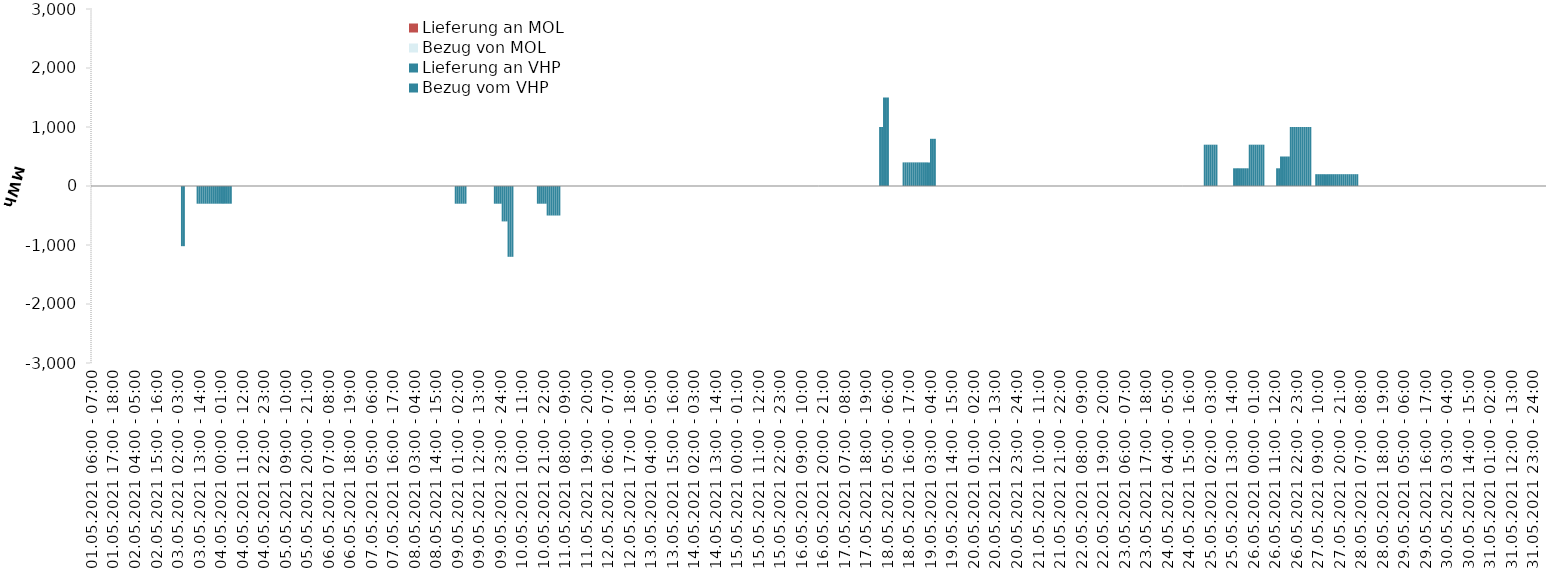
| Category | Bezug vom VHP | Lieferung an VHP | Bezug von MOL | Lieferung an MOL |
|---|---|---|---|---|
| 01.05.2021 06:00 - 07:00 | 0 | 0 | 0 | 0 |
| 01.05.2021 07:00 - 08:00 | 0 | 0 | 0 | 0 |
| 01.05.2021 08:00 - 09:00 | 0 | 0 | 0 | 0 |
| 01.05.2021 09:00 - 10:00 | 0 | 0 | 0 | 0 |
| 01.05.2021 10:00 - 11:00 | 0 | 0 | 0 | 0 |
| 01.05.2021 11:00 - 12:00 | 0 | 0 | 0 | 0 |
| 01.05.2021 12:00 - 13:00 | 0 | 0 | 0 | 0 |
| 01.05.2021 13:00 - 14:00 | 0 | 0 | 0 | 0 |
| 01.05.2021 14:00 - 15:00 | 0 | 0 | 0 | 0 |
| 01.05.2021 15:00 - 16:00 | 0 | 0 | 0 | 0 |
| 01.05.2021 16:00 - 17:00 | 0 | 0 | 0 | 0 |
| 01.05.2021 17:00 - 18:00 | 0 | 0 | 0 | 0 |
| 01.05.2021 18:00 - 19:00 | 0 | 0 | 0 | 0 |
| 01.05.2021 19:00 - 20:00 | 0 | 0 | 0 | 0 |
| 01.05.2021 20:00 - 21:00 | 0 | 0 | 0 | 0 |
| 01.05.2021 21:00 - 22:00 | 0 | 0 | 0 | 0 |
| 01.05.2021 22:00 - 23:00 | 0 | 0 | 0 | 0 |
| 01.05.2021 23:00 - 24:00 | 0 | 0 | 0 | 0 |
| 02.05.2021 00:00 - 01:00 | 0 | 0 | 0 | 0 |
| 02.05.2021 01:00 - 02:00 | 0 | 0 | 0 | 0 |
| 02.05.2021 02:00 - 03:00 | 0 | 0 | 0 | 0 |
| 02.05.2021 03:00 - 04:00 | 0 | 0 | 0 | 0 |
| 02.05.2021 04:00 - 05:00 | 0 | 0 | 0 | 0 |
| 02.05.2021 05:00 - 06:00 | 0 | 0 | 0 | 0 |
| 02.05.2021 06:00 - 07:00 | 0 | 0 | 0 | 0 |
| 02.05.2021 07:00 - 08:00 | 0 | 0 | 0 | 0 |
| 02.05.2021 08:00 - 09:00 | 0 | 0 | 0 | 0 |
| 02.05.2021 09:00 - 10:00 | 0 | 0 | 0 | 0 |
| 02.05.2021 10:00 - 11:00 | 0 | 0 | 0 | 0 |
| 02.05.2021 11:00 - 12:00 | 0 | 0 | 0 | 0 |
| 02.05.2021 12:00 - 13:00 | 0 | 0 | 0 | 0 |
| 02.05.2021 13:00 - 14:00 | 0 | 0 | 0 | 0 |
| 02.05.2021 14:00 - 15:00 | 0 | 0 | 0 | 0 |
| 02.05.2021 15:00 - 16:00 | 0 | 0 | 0 | 0 |
| 02.05.2021 16:00 - 17:00 | 0 | 0 | 0 | 0 |
| 02.05.2021 17:00 - 18:00 | 0 | 0 | 0 | 0 |
| 02.05.2021 18:00 - 19:00 | 0 | 0 | 0 | 0 |
| 02.05.2021 19:00 - 20:00 | 0 | 0 | 0 | 0 |
| 02.05.2021 20:00 - 21:00 | 0 | 0 | 0 | 0 |
| 02.05.2021 21:00 - 22:00 | 0 | 0 | 0 | 0 |
| 02.05.2021 22:00 - 23:00 | 0 | 0 | 0 | 0 |
| 02.05.2021 23:00 - 24:00 | 0 | 0 | 0 | 0 |
| 03.05.2021 00:00 - 01:00 | 0 | 0 | 0 | 0 |
| 03.05.2021 01:00 - 02:00 | 0 | 0 | 0 | 0 |
| 03.05.2021 02:00 - 03:00 | 0 | 0 | 0 | 0 |
| 03.05.2021 03:00 - 04:00 | 0 | 0 | 0 | 0 |
| 03.05.2021 04:00 - 05:00 | 0 | -1020 | 0 | 0 |
| 03.05.2021 05:00 - 06:00 | 0 | -1020 | 0 | 0 |
| 03.05.2021 06:00 - 07:00 | 0 | 0 | 0 | 0 |
| 03.05.2021 07:00 - 08:00 | 0 | 0 | 0 | 0 |
| 03.05.2021 08:00 - 09:00 | 0 | 0 | 0 | 0 |
| 03.05.2021 09:00 - 10:00 | 0 | 0 | 0 | 0 |
| 03.05.2021 10:00 - 11:00 | 0 | 0 | 0 | 0 |
| 03.05.2021 11:00 - 12:00 | 0 | 0 | 0 | 0 |
| 03.05.2021 12:00 - 13:00 | 0 | -300 | 0 | 0 |
| 03.05.2021 13:00 - 14:00 | 0 | -300 | 0 | 0 |
| 03.05.2021 14:00 - 15:00 | 0 | -300 | 0 | 0 |
| 03.05.2021 15:00 - 16:00 | 0 | -300 | 0 | 0 |
| 03.05.2021 16:00 - 17:00 | 0 | -300 | 0 | 0 |
| 03.05.2021 17:00 - 18:00 | 0 | -300 | 0 | 0 |
| 03.05.2021 18:00 - 19:00 | 0 | -300 | 0 | 0 |
| 03.05.2021 19:00 - 20:00 | 0 | -300 | 0 | 0 |
| 03.05.2021 20:00 - 21:00 | 0 | -300 | 0 | 0 |
| 03.05.2021 21:00 - 22:00 | 0 | -300 | 0 | 0 |
| 03.05.2021 22:00 - 23:00 | 0 | -300 | 0 | 0 |
| 03.05.2021 23:00 - 24:00 | 0 | -300 | 0 | 0 |
| 04.05.2021 00:00 - 01:00 | 0 | -300 | 0 | 0 |
| 04.05.2021 01:00 - 02:00 | 0 | -300 | 0 | 0 |
| 04.05.2021 02:00 - 03:00 | 0 | -300 | 0 | 0 |
| 04.05.2021 03:00 - 04:00 | 0 | -300 | 0 | 0 |
| 04.05.2021 04:00 - 05:00 | 0 | -300 | 0 | 0 |
| 04.05.2021 05:00 - 06:00 | 0 | -300 | 0 | 0 |
| 04.05.2021 06:00 - 07:00 | 0 | 0 | 0 | 0 |
| 04.05.2021 07:00 - 08:00 | 0 | 0 | 0 | 0 |
| 04.05.2021 08:00 - 09:00 | 0 | 0 | 0 | 0 |
| 04.05.2021 09:00 - 10:00 | 0 | 0 | 0 | 0 |
| 04.05.2021 10:00 - 11:00 | 0 | 0 | 0 | 0 |
| 04.05.2021 11:00 - 12:00 | 0 | 0 | 0 | 0 |
| 04.05.2021 12:00 - 13:00 | 0 | 0 | 0 | 0 |
| 04.05.2021 13:00 - 14:00 | 0 | 0 | 0 | 0 |
| 04.05.2021 14:00 - 15:00 | 0 | 0 | 0 | 0 |
| 04.05.2021 15:00 - 16:00 | 0 | 0 | 0 | 0 |
| 04.05.2021 16:00 - 17:00 | 0 | 0 | 0 | 0 |
| 04.05.2021 17:00 - 18:00 | 0 | 0 | 0 | 0 |
| 04.05.2021 18:00 - 19:00 | 0 | 0 | 0 | 0 |
| 04.05.2021 19:00 - 20:00 | 0 | 0 | 0 | 0 |
| 04.05.2021 20:00 - 21:00 | 0 | 0 | 0 | 0 |
| 04.05.2021 21:00 - 22:00 | 0 | 0 | 0 | 0 |
| 04.05.2021 22:00 - 23:00 | 0 | 0 | 0 | 0 |
| 04.05.2021 23:00 - 24:00 | 0 | 0 | 0 | 0 |
| 05.05.2021 00:00 - 01:00 | 0 | 0 | 0 | 0 |
| 05.05.2021 01:00 - 02:00 | 0 | 0 | 0 | 0 |
| 05.05.2021 02:00 - 03:00 | 0 | 0 | 0 | 0 |
| 05.05.2021 03:00 - 04:00 | 0 | 0 | 0 | 0 |
| 05.05.2021 04:00 - 05:00 | 0 | 0 | 0 | 0 |
| 05.05.2021 05:00 - 06:00 | 0 | 0 | 0 | 0 |
| 05.05.2021 06:00 - 07:00 | 0 | 0 | 0 | 0 |
| 05.05.2021 07:00 - 08:00 | 0 | 0 | 0 | 0 |
| 05.05.2021 08:00 - 09:00 | 0 | 0 | 0 | 0 |
| 05.05.2021 09:00 - 10:00 | 0 | 0 | 0 | 0 |
| 05.05.2021 10:00 - 11:00 | 0 | 0 | 0 | 0 |
| 05.05.2021 11:00 - 12:00 | 0 | 0 | 0 | 0 |
| 05.05.2021 12:00 - 13:00 | 0 | 0 | 0 | 0 |
| 05.05.2021 13:00 - 14:00 | 0 | 0 | 0 | 0 |
| 05.05.2021 14:00 - 15:00 | 0 | 0 | 0 | 0 |
| 05.05.2021 15:00 - 16:00 | 0 | 0 | 0 | 0 |
| 05.05.2021 16:00 - 17:00 | 0 | 0 | 0 | 0 |
| 05.05.2021 17:00 - 18:00 | 0 | 0 | 0 | 0 |
| 05.05.2021 18:00 - 19:00 | 0 | 0 | 0 | 0 |
| 05.05.2021 19:00 - 20:00 | 0 | 0 | 0 | 0 |
| 05.05.2021 20:00 - 21:00 | 0 | 0 | 0 | 0 |
| 05.05.2021 21:00 - 22:00 | 0 | 0 | 0 | 0 |
| 05.05.2021 22:00 - 23:00 | 0 | 0 | 0 | 0 |
| 05.05.2021 23:00 - 24:00 | 0 | 0 | 0 | 0 |
| 06.05.2021 00:00 - 01:00 | 0 | 0 | 0 | 0 |
| 06.05.2021 01:00 - 02:00 | 0 | 0 | 0 | 0 |
| 06.05.2021 02:00 - 03:00 | 0 | 0 | 0 | 0 |
| 06.05.2021 03:00 - 04:00 | 0 | 0 | 0 | 0 |
| 06.05.2021 04:00 - 05:00 | 0 | 0 | 0 | 0 |
| 06.05.2021 05:00 - 06:00 | 0 | 0 | 0 | 0 |
| 06.05.2021 06:00 - 07:00 | 0 | 0 | 0 | 0 |
| 06.05.2021 07:00 - 08:00 | 0 | 0 | 0 | 0 |
| 06.05.2021 08:00 - 09:00 | 0 | 0 | 0 | 0 |
| 06.05.2021 09:00 - 10:00 | 0 | 0 | 0 | 0 |
| 06.05.2021 10:00 - 11:00 | 0 | 0 | 0 | 0 |
| 06.05.2021 11:00 - 12:00 | 0 | 0 | 0 | 0 |
| 06.05.2021 12:00 - 13:00 | 0 | 0 | 0 | 0 |
| 06.05.2021 13:00 - 14:00 | 0 | 0 | 0 | 0 |
| 06.05.2021 14:00 - 15:00 | 0 | 0 | 0 | 0 |
| 06.05.2021 15:00 - 16:00 | 0 | 0 | 0 | 0 |
| 06.05.2021 16:00 - 17:00 | 0 | 0 | 0 | 0 |
| 06.05.2021 17:00 - 18:00 | 0 | 0 | 0 | 0 |
| 06.05.2021 18:00 - 19:00 | 0 | 0 | 0 | 0 |
| 06.05.2021 19:00 - 20:00 | 0 | 0 | 0 | 0 |
| 06.05.2021 20:00 - 21:00 | 0 | 0 | 0 | 0 |
| 06.05.2021 21:00 - 22:00 | 0 | 0 | 0 | 0 |
| 06.05.2021 22:00 - 23:00 | 0 | 0 | 0 | 0 |
| 06.05.2021 23:00 - 24:00 | 0 | 0 | 0 | 0 |
| 07.05.2021 00:00 - 01:00 | 0 | 0 | 0 | 0 |
| 07.05.2021 01:00 - 02:00 | 0 | 0 | 0 | 0 |
| 07.05.2021 02:00 - 03:00 | 0 | 0 | 0 | 0 |
| 07.05.2021 03:00 - 04:00 | 0 | 0 | 0 | 0 |
| 07.05.2021 04:00 - 05:00 | 0 | 0 | 0 | 0 |
| 07.05.2021 05:00 - 06:00 | 0 | 0 | 0 | 0 |
| 07.05.2021 06:00 - 07:00 | 0 | 0 | 0 | 0 |
| 07.05.2021 07:00 - 08:00 | 0 | 0 | 0 | 0 |
| 07.05.2021 08:00 - 09:00 | 0 | 0 | 0 | 0 |
| 07.05.2021 09:00 - 10:00 | 0 | 0 | 0 | 0 |
| 07.05.2021 10:00 - 11:00 | 0 | 0 | 0 | 0 |
| 07.05.2021 11:00 - 12:00 | 0 | 0 | 0 | 0 |
| 07.05.2021 12:00 - 13:00 | 0 | 0 | 0 | 0 |
| 07.05.2021 13:00 - 14:00 | 0 | 0 | 0 | 0 |
| 07.05.2021 14:00 - 15:00 | 0 | 0 | 0 | 0 |
| 07.05.2021 15:00 - 16:00 | 0 | 0 | 0 | 0 |
| 07.05.2021 16:00 - 17:00 | 0 | 0 | 0 | 0 |
| 07.05.2021 17:00 - 18:00 | 0 | 0 | 0 | 0 |
| 07.05.2021 18:00 - 19:00 | 0 | 0 | 0 | 0 |
| 07.05.2021 19:00 - 20:00 | 0 | 0 | 0 | 0 |
| 07.05.2021 20:00 - 21:00 | 0 | 0 | 0 | 0 |
| 07.05.2021 21:00 - 22:00 | 0 | 0 | 0 | 0 |
| 07.05.2021 22:00 - 23:00 | 0 | 0 | 0 | 0 |
| 07.05.2021 23:00 - 24:00 | 0 | 0 | 0 | 0 |
| 08.05.2021 00:00 - 01:00 | 0 | 0 | 0 | 0 |
| 08.05.2021 01:00 - 02:00 | 0 | 0 | 0 | 0 |
| 08.05.2021 02:00 - 03:00 | 0 | 0 | 0 | 0 |
| 08.05.2021 03:00 - 04:00 | 0 | 0 | 0 | 0 |
| 08.05.2021 04:00 - 05:00 | 0 | 0 | 0 | 0 |
| 08.05.2021 05:00 - 06:00 | 0 | 0 | 0 | 0 |
| 08.05.2021 06:00 - 07:00 | 0 | 0 | 0 | 0 |
| 08.05.2021 07:00 - 08:00 | 0 | 0 | 0 | 0 |
| 08.05.2021 08:00 - 09:00 | 0 | 0 | 0 | 0 |
| 08.05.2021 09:00 - 10:00 | 0 | 0 | 0 | 0 |
| 08.05.2021 10:00 - 11:00 | 0 | 0 | 0 | 0 |
| 08.05.2021 11:00 - 12:00 | 0 | 0 | 0 | 0 |
| 08.05.2021 12:00 - 13:00 | 0 | 0 | 0 | 0 |
| 08.05.2021 13:00 - 14:00 | 0 | 0 | 0 | 0 |
| 08.05.2021 14:00 - 15:00 | 0 | 0 | 0 | 0 |
| 08.05.2021 15:00 - 16:00 | 0 | 0 | 0 | 0 |
| 08.05.2021 16:00 - 17:00 | 0 | 0 | 0 | 0 |
| 08.05.2021 17:00 - 18:00 | 0 | 0 | 0 | 0 |
| 08.05.2021 18:00 - 19:00 | 0 | 0 | 0 | 0 |
| 08.05.2021 19:00 - 20:00 | 0 | 0 | 0 | 0 |
| 08.05.2021 20:00 - 21:00 | 0 | 0 | 0 | 0 |
| 08.05.2021 21:00 - 22:00 | 0 | 0 | 0 | 0 |
| 08.05.2021 22:00 - 23:00 | 0 | 0 | 0 | 0 |
| 08.05.2021 23:00 - 24:00 | 0 | 0 | 0 | 0 |
| 09.05.2021 00:00 - 01:00 | 0 | -300 | 0 | 0 |
| 09.05.2021 01:00 - 02:00 | 0 | -300 | 0 | 0 |
| 09.05.2021 02:00 - 03:00 | 0 | -300 | 0 | 0 |
| 09.05.2021 03:00 - 04:00 | 0 | -300 | 0 | 0 |
| 09.05.2021 04:00 - 05:00 | 0 | -300 | 0 | 0 |
| 09.05.2021 05:00 - 06:00 | 0 | -300 | 0 | 0 |
| 09.05.2021 06:00 - 07:00 | 0 | 0 | 0 | 0 |
| 09.05.2021 07:00 - 08:00 | 0 | 0 | 0 | 0 |
| 09.05.2021 08:00 - 09:00 | 0 | 0 | 0 | 0 |
| 09.05.2021 09:00 - 10:00 | 0 | 0 | 0 | 0 |
| 09.05.2021 10:00 - 11:00 | 0 | 0 | 0 | 0 |
| 09.05.2021 11:00 - 12:00 | 0 | 0 | 0 | 0 |
| 09.05.2021 12:00 - 13:00 | 0 | 0 | 0 | 0 |
| 09.05.2021 13:00 - 14:00 | 0 | 0 | 0 | 0 |
| 09.05.2021 14:00 - 15:00 | 0 | 0 | 0 | 0 |
| 09.05.2021 15:00 - 16:00 | 0 | 0 | 0 | 0 |
| 09.05.2021 16:00 - 17:00 | 0 | 0 | 0 | 0 |
| 09.05.2021 17:00 - 18:00 | 0 | 0 | 0 | 0 |
| 09.05.2021 18:00 - 19:00 | 0 | 0 | 0 | 0 |
| 09.05.2021 19:00 - 20:00 | 0 | 0 | 0 | 0 |
| 09.05.2021 20:00 - 21:00 | 0 | -300 | 0 | 0 |
| 09.05.2021 21:00 - 22:00 | 0 | -300 | 0 | 0 |
| 09.05.2021 22:00 - 23:00 | 0 | -300 | 0 | 0 |
| 09.05.2021 23:00 - 24:00 | 0 | -300 | 0 | 0 |
| 10.05.2021 00:00 - 01:00 | 0 | -600 | 0 | 0 |
| 10.05.2021 01:00 - 02:00 | 0 | -600 | 0 | 0 |
| 10.05.2021 02:00 - 03:00 | 0 | -600 | 0 | 0 |
| 10.05.2021 03:00 - 04:00 | 0 | -1200 | 0 | 0 |
| 10.05.2021 04:00 - 05:00 | 0 | -1200 | 0 | 0 |
| 10.05.2021 05:00 - 06:00 | 0 | -1200 | 0 | 0 |
| 10.05.2021 06:00 - 07:00 | 0 | 0 | 0 | 0 |
| 10.05.2021 07:00 - 08:00 | 0 | 0 | 0 | 0 |
| 10.05.2021 08:00 - 09:00 | 0 | 0 | 0 | 0 |
| 10.05.2021 09:00 - 10:00 | 0 | 0 | 0 | 0 |
| 10.05.2021 10:00 - 11:00 | 0 | 0 | 0 | 0 |
| 10.05.2021 11:00 - 12:00 | 0 | 0 | 0 | 0 |
| 10.05.2021 12:00 - 13:00 | 0 | 0 | 0 | 0 |
| 10.05.2021 13:00 - 14:00 | 0 | 0 | 0 | 0 |
| 10.05.2021 14:00 - 15:00 | 0 | 0 | 0 | 0 |
| 10.05.2021 15:00 - 16:00 | 0 | 0 | 0 | 0 |
| 10.05.2021 16:00 - 17:00 | 0 | 0 | 0 | 0 |
| 10.05.2021 17:00 - 18:00 | 0 | 0 | 0 | 0 |
| 10.05.2021 18:00 - 19:00 | 0 | -300 | 0 | 0 |
| 10.05.2021 19:00 - 20:00 | 0 | -300 | 0 | 0 |
| 10.05.2021 20:00 - 21:00 | 0 | -300 | 0 | 0 |
| 10.05.2021 21:00 - 22:00 | 0 | -300 | 0 | 0 |
| 10.05.2021 22:00 - 23:00 | 0 | -300 | 0 | 0 |
| 10.05.2021 23:00 - 24:00 | 0 | -500 | 0 | 0 |
| 11.05.2021 00:00 - 01:00 | 0 | -500 | 0 | 0 |
| 11.05.2021 01:00 - 02:00 | 0 | -500 | 0 | 0 |
| 11.05.2021 02:00 - 03:00 | 0 | -500 | 0 | 0 |
| 11.05.2021 03:00 - 04:00 | 0 | -500 | 0 | 0 |
| 11.05.2021 04:00 - 05:00 | 0 | -500 | 0 | 0 |
| 11.05.2021 05:00 - 06:00 | 0 | -500 | 0 | 0 |
| 11.05.2021 06:00 - 07:00 | 0 | 0 | 0 | 0 |
| 11.05.2021 07:00 - 08:00 | 0 | 0 | 0 | 0 |
| 11.05.2021 08:00 - 09:00 | 0 | 0 | 0 | 0 |
| 11.05.2021 09:00 - 10:00 | 0 | 0 | 0 | 0 |
| 11.05.2021 10:00 - 11:00 | 0 | 0 | 0 | 0 |
| 11.05.2021 11:00 - 12:00 | 0 | 0 | 0 | 0 |
| 11.05.2021 12:00 - 13:00 | 0 | 0 | 0 | 0 |
| 11.05.2021 13:00 - 14:00 | 0 | 0 | 0 | 0 |
| 11.05.2021 14:00 - 15:00 | 0 | 0 | 0 | 0 |
| 11.05.2021 15:00 - 16:00 | 0 | 0 | 0 | 0 |
| 11.05.2021 16:00 - 17:00 | 0 | 0 | 0 | 0 |
| 11.05.2021 17:00 - 18:00 | 0 | 0 | 0 | 0 |
| 11.05.2021 18:00 - 19:00 | 0 | 0 | 0 | 0 |
| 11.05.2021 19:00 - 20:00 | 0 | 0 | 0 | 0 |
| 11.05.2021 20:00 - 21:00 | 0 | 0 | 0 | 0 |
| 11.05.2021 21:00 - 22:00 | 0 | 0 | 0 | 0 |
| 11.05.2021 22:00 - 23:00 | 0 | 0 | 0 | 0 |
| 11.05.2021 23:00 - 24:00 | 0 | 0 | 0 | 0 |
| 12.05.2021 00:00 - 01:00 | 0 | 0 | 0 | 0 |
| 12.05.2021 01:00 - 02:00 | 0 | 0 | 0 | 0 |
| 12.05.2021 02:00 - 03:00 | 0 | 0 | 0 | 0 |
| 12.05.2021 03:00 - 04:00 | 0 | 0 | 0 | 0 |
| 12.05.2021 04:00 - 05:00 | 0 | 0 | 0 | 0 |
| 12.05.2021 05:00 - 06:00 | 0 | 0 | 0 | 0 |
| 12.05.2021 06:00 - 07:00 | 0 | 0 | 0 | 0 |
| 12.05.2021 07:00 - 08:00 | 0 | 0 | 0 | 0 |
| 12.05.2021 08:00 - 09:00 | 0 | 0 | 0 | 0 |
| 12.05.2021 09:00 - 10:00 | 0 | 0 | 0 | 0 |
| 12.05.2021 10:00 - 11:00 | 0 | 0 | 0 | 0 |
| 12.05.2021 11:00 - 12:00 | 0 | 0 | 0 | 0 |
| 12.05.2021 12:00 - 13:00 | 0 | 0 | 0 | 0 |
| 12.05.2021 13:00 - 14:00 | 0 | 0 | 0 | 0 |
| 12.05.2021 14:00 - 15:00 | 0 | 0 | 0 | 0 |
| 12.05.2021 15:00 - 16:00 | 0 | 0 | 0 | 0 |
| 12.05.2021 16:00 - 17:00 | 0 | 0 | 0 | 0 |
| 12.05.2021 17:00 - 18:00 | 0 | 0 | 0 | 0 |
| 12.05.2021 18:00 - 19:00 | 0 | 0 | 0 | 0 |
| 12.05.2021 19:00 - 20:00 | 0 | 0 | 0 | 0 |
| 12.05.2021 20:00 - 21:00 | 0 | 0 | 0 | 0 |
| 12.05.2021 21:00 - 22:00 | 0 | 0 | 0 | 0 |
| 12.05.2021 22:00 - 23:00 | 0 | 0 | 0 | 0 |
| 12.05.2021 23:00 - 24:00 | 0 | 0 | 0 | 0 |
| 13.05.2021 00:00 - 01:00 | 0 | 0 | 0 | 0 |
| 13.05.2021 01:00 - 02:00 | 0 | 0 | 0 | 0 |
| 13.05.2021 02:00 - 03:00 | 0 | 0 | 0 | 0 |
| 13.05.2021 03:00 - 04:00 | 0 | 0 | 0 | 0 |
| 13.05.2021 04:00 - 05:00 | 0 | 0 | 0 | 0 |
| 13.05.2021 05:00 - 06:00 | 0 | 0 | 0 | 0 |
| 13.05.2021 06:00 - 07:00 | 0 | 0 | 0 | 0 |
| 13.05.2021 07:00 - 08:00 | 0 | 0 | 0 | 0 |
| 13.05.2021 08:00 - 09:00 | 0 | 0 | 0 | 0 |
| 13.05.2021 09:00 - 10:00 | 0 | 0 | 0 | 0 |
| 13.05.2021 10:00 - 11:00 | 0 | 0 | 0 | 0 |
| 13.05.2021 11:00 - 12:00 | 0 | 0 | 0 | 0 |
| 13.05.2021 12:00 - 13:00 | 0 | 0 | 0 | 0 |
| 13.05.2021 13:00 - 14:00 | 0 | 0 | 0 | 0 |
| 13.05.2021 14:00 - 15:00 | 0 | 0 | 0 | 0 |
| 13.05.2021 15:00 - 16:00 | 0 | 0 | 0 | 0 |
| 13.05.2021 16:00 - 17:00 | 0 | 0 | 0 | 0 |
| 13.05.2021 17:00 - 18:00 | 0 | 0 | 0 | 0 |
| 13.05.2021 18:00 - 19:00 | 0 | 0 | 0 | 0 |
| 13.05.2021 19:00 - 20:00 | 0 | 0 | 0 | 0 |
| 13.05.2021 20:00 - 21:00 | 0 | 0 | 0 | 0 |
| 13.05.2021 21:00 - 22:00 | 0 | 0 | 0 | 0 |
| 13.05.2021 22:00 - 23:00 | 0 | 0 | 0 | 0 |
| 13.05.2021 23:00 - 24:00 | 0 | 0 | 0 | 0 |
| 14.05.2021 00:00 - 01:00 | 0 | 0 | 0 | 0 |
| 14.05.2021 01:00 - 02:00 | 0 | 0 | 0 | 0 |
| 14.05.2021 02:00 - 03:00 | 0 | 0 | 0 | 0 |
| 14.05.2021 03:00 - 04:00 | 0 | 0 | 0 | 0 |
| 14.05.2021 04:00 - 05:00 | 0 | 0 | 0 | 0 |
| 14.05.2021 05:00 - 06:00 | 0 | 0 | 0 | 0 |
| 14.05.2021 06:00 - 07:00 | 0 | 0 | 0 | 0 |
| 14.05.2021 07:00 - 08:00 | 0 | 0 | 0 | 0 |
| 14.05.2021 08:00 - 09:00 | 0 | 0 | 0 | 0 |
| 14.05.2021 09:00 - 10:00 | 0 | 0 | 0 | 0 |
| 14.05.2021 10:00 - 11:00 | 0 | 0 | 0 | 0 |
| 14.05.2021 11:00 - 12:00 | 0 | 0 | 0 | 0 |
| 14.05.2021 12:00 - 13:00 | 0 | 0 | 0 | 0 |
| 14.05.2021 13:00 - 14:00 | 0 | 0 | 0 | 0 |
| 14.05.2021 14:00 - 15:00 | 0 | 0 | 0 | 0 |
| 14.05.2021 15:00 - 16:00 | 0 | 0 | 0 | 0 |
| 14.05.2021 16:00 - 17:00 | 0 | 0 | 0 | 0 |
| 14.05.2021 17:00 - 18:00 | 0 | 0 | 0 | 0 |
| 14.05.2021 18:00 - 19:00 | 0 | 0 | 0 | 0 |
| 14.05.2021 19:00 - 20:00 | 0 | 0 | 0 | 0 |
| 14.05.2021 20:00 - 21:00 | 0 | 0 | 0 | 0 |
| 14.05.2021 21:00 - 22:00 | 0 | 0 | 0 | 0 |
| 14.05.2021 22:00 - 23:00 | 0 | 0 | 0 | 0 |
| 14.05.2021 23:00 - 24:00 | 0 | 0 | 0 | 0 |
| 15.05.2021 00:00 - 01:00 | 0 | 0 | 0 | 0 |
| 15.05.2021 01:00 - 02:00 | 0 | 0 | 0 | 0 |
| 15.05.2021 02:00 - 03:00 | 0 | 0 | 0 | 0 |
| 15.05.2021 03:00 - 04:00 | 0 | 0 | 0 | 0 |
| 15.05.2021 04:00 - 05:00 | 0 | 0 | 0 | 0 |
| 15.05.2021 05:00 - 06:00 | 0 | 0 | 0 | 0 |
| 15.05.2021 06:00 - 07:00 | 0 | 0 | 0 | 0 |
| 15.05.2021 07:00 - 08:00 | 0 | 0 | 0 | 0 |
| 15.05.2021 08:00 - 09:00 | 0 | 0 | 0 | 0 |
| 15.05.2021 09:00 - 10:00 | 0 | 0 | 0 | 0 |
| 15.05.2021 10:00 - 11:00 | 0 | 0 | 0 | 0 |
| 15.05.2021 11:00 - 12:00 | 0 | 0 | 0 | 0 |
| 15.05.2021 12:00 - 13:00 | 0 | 0 | 0 | 0 |
| 15.05.2021 13:00 - 14:00 | 0 | 0 | 0 | 0 |
| 15.05.2021 14:00 - 15:00 | 0 | 0 | 0 | 0 |
| 15.05.2021 15:00 - 16:00 | 0 | 0 | 0 | 0 |
| 15.05.2021 16:00 - 17:00 | 0 | 0 | 0 | 0 |
| 15.05.2021 17:00 - 18:00 | 0 | 0 | 0 | 0 |
| 15.05.2021 18:00 - 19:00 | 0 | 0 | 0 | 0 |
| 15.05.2021 19:00 - 20:00 | 0 | 0 | 0 | 0 |
| 15.05.2021 20:00 - 21:00 | 0 | 0 | 0 | 0 |
| 15.05.2021 21:00 - 22:00 | 0 | 0 | 0 | 0 |
| 15.05.2021 22:00 - 23:00 | 0 | 0 | 0 | 0 |
| 15.05.2021 23:00 - 24:00 | 0 | 0 | 0 | 0 |
| 16.05.2021 00:00 - 01:00 | 0 | 0 | 0 | 0 |
| 16.05.2021 01:00 - 02:00 | 0 | 0 | 0 | 0 |
| 16.05.2021 02:00 - 03:00 | 0 | 0 | 0 | 0 |
| 16.05.2021 03:00 - 04:00 | 0 | 0 | 0 | 0 |
| 16.05.2021 04:00 - 05:00 | 0 | 0 | 0 | 0 |
| 16.05.2021 05:00 - 06:00 | 0 | 0 | 0 | 0 |
| 16.05.2021 06:00 - 07:00 | 0 | 0 | 0 | 0 |
| 16.05.2021 07:00 - 08:00 | 0 | 0 | 0 | 0 |
| 16.05.2021 08:00 - 09:00 | 0 | 0 | 0 | 0 |
| 16.05.2021 09:00 - 10:00 | 0 | 0 | 0 | 0 |
| 16.05.2021 10:00 - 11:00 | 0 | 0 | 0 | 0 |
| 16.05.2021 11:00 - 12:00 | 0 | 0 | 0 | 0 |
| 16.05.2021 12:00 - 13:00 | 0 | 0 | 0 | 0 |
| 16.05.2021 13:00 - 14:00 | 0 | 0 | 0 | 0 |
| 16.05.2021 14:00 - 15:00 | 0 | 0 | 0 | 0 |
| 16.05.2021 15:00 - 16:00 | 0 | 0 | 0 | 0 |
| 16.05.2021 16:00 - 17:00 | 0 | 0 | 0 | 0 |
| 16.05.2021 17:00 - 18:00 | 0 | 0 | 0 | 0 |
| 16.05.2021 18:00 - 19:00 | 0 | 0 | 0 | 0 |
| 16.05.2021 19:00 - 20:00 | 0 | 0 | 0 | 0 |
| 16.05.2021 20:00 - 21:00 | 0 | 0 | 0 | 0 |
| 16.05.2021 21:00 - 22:00 | 0 | 0 | 0 | 0 |
| 16.05.2021 22:00 - 23:00 | 0 | 0 | 0 | 0 |
| 16.05.2021 23:00 - 24:00 | 0 | 0 | 0 | 0 |
| 17.05.2021 00:00 - 01:00 | 0 | 0 | 0 | 0 |
| 17.05.2021 01:00 - 02:00 | 0 | 0 | 0 | 0 |
| 17.05.2021 02:00 - 03:00 | 0 | 0 | 0 | 0 |
| 17.05.2021 03:00 - 04:00 | 0 | 0 | 0 | 0 |
| 17.05.2021 04:00 - 05:00 | 0 | 0 | 0 | 0 |
| 17.05.2021 05:00 - 06:00 | 0 | 0 | 0 | 0 |
| 17.05.2021 06:00 - 07:00 | 0 | 0 | 0 | 0 |
| 17.05.2021 07:00 - 08:00 | 0 | 0 | 0 | 0 |
| 17.05.2021 08:00 - 09:00 | 0 | 0 | 0 | 0 |
| 17.05.2021 09:00 - 10:00 | 0 | 0 | 0 | 0 |
| 17.05.2021 10:00 - 11:00 | 0 | 0 | 0 | 0 |
| 17.05.2021 11:00 - 12:00 | 0 | 0 | 0 | 0 |
| 17.05.2021 12:00 - 13:00 | 0 | 0 | 0 | 0 |
| 17.05.2021 13:00 - 14:00 | 0 | 0 | 0 | 0 |
| 17.05.2021 14:00 - 15:00 | 0 | 0 | 0 | 0 |
| 17.05.2021 15:00 - 16:00 | 0 | 0 | 0 | 0 |
| 17.05.2021 16:00 - 17:00 | 0 | 0 | 0 | 0 |
| 17.05.2021 17:00 - 18:00 | 0 | 0 | 0 | 0 |
| 17.05.2021 18:00 - 19:00 | 0 | 0 | 0 | 0 |
| 17.05.2021 19:00 - 20:00 | 0 | 0 | 0 | 0 |
| 17.05.2021 20:00 - 21:00 | 0 | 0 | 0 | 0 |
| 17.05.2021 21:00 - 22:00 | 0 | 0 | 0 | 0 |
| 17.05.2021 22:00 - 23:00 | 0 | 0 | 0 | 0 |
| 17.05.2021 23:00 - 24:00 | 0 | 0 | 0 | 0 |
| 18.05.2021 00:00 - 01:00 | 0 | 0 | 0 | 0 |
| 18.05.2021 01:00 - 02:00 | 1000 | 0 | 0 | 0 |
| 18.05.2021 02:00 - 03:00 | 1000 | 0 | 0 | 0 |
| 18.05.2021 03:00 - 04:00 | 1500 | 0 | 0 | 0 |
| 18.05.2021 04:00 - 05:00 | 1500 | 0 | 0 | 0 |
| 18.05.2021 05:00 - 06:00 | 1500 | 0 | 0 | 0 |
| 18.05.2021 06:00 - 07:00 | 0 | 0 | 0 | 0 |
| 18.05.2021 07:00 - 08:00 | 0 | 0 | 0 | 0 |
| 18.05.2021 08:00 - 09:00 | 0 | 0 | 0 | 0 |
| 18.05.2021 09:00 - 10:00 | 0 | 0 | 0 | 0 |
| 18.05.2021 10:00 - 11:00 | 0 | 0 | 0 | 0 |
| 18.05.2021 11:00 - 12:00 | 0 | 0 | 0 | 0 |
| 18.05.2021 12:00 - 13:00 | 0 | 0 | 0 | 0 |
| 18.05.2021 13:00 - 14:00 | 400 | 0 | 0 | 0 |
| 18.05.2021 14:00 - 15:00 | 400 | 0 | 0 | 0 |
| 18.05.2021 15:00 - 16:00 | 400 | 0 | 0 | 0 |
| 18.05.2021 16:00 - 17:00 | 400 | 0 | 0 | 0 |
| 18.05.2021 17:00 - 18:00 | 400 | 0 | 0 | 0 |
| 18.05.2021 18:00 - 19:00 | 400 | 0 | 0 | 0 |
| 18.05.2021 19:00 - 20:00 | 400 | 0 | 0 | 0 |
| 18.05.2021 20:00 - 21:00 | 400 | 0 | 0 | 0 |
| 18.05.2021 21:00 - 22:00 | 400 | 0 | 0 | 0 |
| 18.05.2021 22:00 - 23:00 | 400 | 0 | 0 | 0 |
| 18.05.2021 23:00 - 24:00 | 400 | 0 | 0 | 0 |
| 19.05.2021 00:00 - 01:00 | 400 | 0 | 0 | 0 |
| 19.05.2021 01:00 - 02:00 | 400 | 0 | 0 | 0 |
| 19.05.2021 02:00 - 03:00 | 400 | 0 | 0 | 0 |
| 19.05.2021 03:00 - 04:00 | 800 | 0 | 0 | 0 |
| 19.05.2021 04:00 - 05:00 | 800 | 0 | 0 | 0 |
| 19.05.2021 05:00 - 06:00 | 800 | 0 | 0 | 0 |
| 19.05.2021 06:00 - 07:00 | 0 | 0 | 0 | 0 |
| 19.05.2021 07:00 - 08:00 | 0 | 0 | 0 | 0 |
| 19.05.2021 08:00 - 09:00 | 0 | 0 | 0 | 0 |
| 19.05.2021 09:00 - 10:00 | 0 | 0 | 0 | 0 |
| 19.05.2021 10:00 - 11:00 | 0 | 0 | 0 | 0 |
| 19.05.2021 11:00 - 12:00 | 0 | 0 | 0 | 0 |
| 19.05.2021 12:00 - 13:00 | 0 | 0 | 0 | 0 |
| 19.05.2021 13:00 - 14:00 | 0 | 0 | 0 | 0 |
| 19.05.2021 14:00 - 15:00 | 0 | 0 | 0 | 0 |
| 19.05.2021 15:00 - 16:00 | 0 | 0 | 0 | 0 |
| 19.05.2021 16:00 - 17:00 | 0 | 0 | 0 | 0 |
| 19.05.2021 17:00 - 18:00 | 0 | 0 | 0 | 0 |
| 19.05.2021 18:00 - 19:00 | 0 | 0 | 0 | 0 |
| 19.05.2021 19:00 - 20:00 | 0 | 0 | 0 | 0 |
| 19.05.2021 20:00 - 21:00 | 0 | 0 | 0 | 0 |
| 19.05.2021 21:00 - 22:00 | 0 | 0 | 0 | 0 |
| 19.05.2021 22:00 - 23:00 | 0 | 0 | 0 | 0 |
| 19.05.2021 23:00 - 24:00 | 0 | 0 | 0 | 0 |
| 20.05.2021 00:00 - 01:00 | 0 | 0 | 0 | 0 |
| 20.05.2021 01:00 - 02:00 | 0 | 0 | 0 | 0 |
| 20.05.2021 02:00 - 03:00 | 0 | 0 | 0 | 0 |
| 20.05.2021 03:00 - 04:00 | 0 | 0 | 0 | 0 |
| 20.05.2021 04:00 - 05:00 | 0 | 0 | 0 | 0 |
| 20.05.2021 05:00 - 06:00 | 0 | 0 | 0 | 0 |
| 20.05.2021 06:00 - 07:00 | 0 | 0 | 0 | 0 |
| 20.05.2021 07:00 - 08:00 | 0 | 0 | 0 | 0 |
| 20.05.2021 08:00 - 09:00 | 0 | 0 | 0 | 0 |
| 20.05.2021 09:00 - 10:00 | 0 | 0 | 0 | 0 |
| 20.05.2021 10:00 - 11:00 | 0 | 0 | 0 | 0 |
| 20.05.2021 11:00 - 12:00 | 0 | 0 | 0 | 0 |
| 20.05.2021 12:00 - 13:00 | 0 | 0 | 0 | 0 |
| 20.05.2021 13:00 - 14:00 | 0 | 0 | 0 | 0 |
| 20.05.2021 14:00 - 15:00 | 0 | 0 | 0 | 0 |
| 20.05.2021 15:00 - 16:00 | 0 | 0 | 0 | 0 |
| 20.05.2021 16:00 - 17:00 | 0 | 0 | 0 | 0 |
| 20.05.2021 17:00 - 18:00 | 0 | 0 | 0 | 0 |
| 20.05.2021 18:00 - 19:00 | 0 | 0 | 0 | 0 |
| 20.05.2021 19:00 - 20:00 | 0 | 0 | 0 | 0 |
| 20.05.2021 20:00 - 21:00 | 0 | 0 | 0 | 0 |
| 20.05.2021 21:00 - 22:00 | 0 | 0 | 0 | 0 |
| 20.05.2021 22:00 - 23:00 | 0 | 0 | 0 | 0 |
| 20.05.2021 23:00 - 24:00 | 0 | 0 | 0 | 0 |
| 21.05.2021 00:00 - 01:00 | 0 | 0 | 0 | 0 |
| 21.05.2021 01:00 - 02:00 | 0 | 0 | 0 | 0 |
| 21.05.2021 02:00 - 03:00 | 0 | 0 | 0 | 0 |
| 21.05.2021 03:00 - 04:00 | 0 | 0 | 0 | 0 |
| 21.05.2021 04:00 - 05:00 | 0 | 0 | 0 | 0 |
| 21.05.2021 05:00 - 06:00 | 0 | 0 | 0 | 0 |
| 21.05.2021 06:00 - 07:00 | 0 | 0 | 0 | 0 |
| 21.05.2021 07:00 - 08:00 | 0 | 0 | 0 | 0 |
| 21.05.2021 08:00 - 09:00 | 0 | 0 | 0 | 0 |
| 21.05.2021 09:00 - 10:00 | 0 | 0 | 0 | 0 |
| 21.05.2021 10:00 - 11:00 | 0 | 0 | 0 | 0 |
| 21.05.2021 11:00 - 12:00 | 0 | 0 | 0 | 0 |
| 21.05.2021 12:00 - 13:00 | 0 | 0 | 0 | 0 |
| 21.05.2021 13:00 - 14:00 | 0 | 0 | 0 | 0 |
| 21.05.2021 14:00 - 15:00 | 0 | 0 | 0 | 0 |
| 21.05.2021 15:00 - 16:00 | 0 | 0 | 0 | 0 |
| 21.05.2021 16:00 - 17:00 | 0 | 0 | 0 | 0 |
| 21.05.2021 17:00 - 18:00 | 0 | 0 | 0 | 0 |
| 21.05.2021 18:00 - 19:00 | 0 | 0 | 0 | 0 |
| 21.05.2021 19:00 - 20:00 | 0 | 0 | 0 | 0 |
| 21.05.2021 20:00 - 21:00 | 0 | 0 | 0 | 0 |
| 21.05.2021 21:00 - 22:00 | 0 | 0 | 0 | 0 |
| 21.05.2021 22:00 - 23:00 | 0 | 0 | 0 | 0 |
| 21.05.2021 23:00 - 24:00 | 0 | 0 | 0 | 0 |
| 22.05.2021 00:00 - 01:00 | 0 | 0 | 0 | 0 |
| 22.05.2021 01:00 - 02:00 | 0 | 0 | 0 | 0 |
| 22.05.2021 02:00 - 03:00 | 0 | 0 | 0 | 0 |
| 22.05.2021 03:00 - 04:00 | 0 | 0 | 0 | 0 |
| 22.05.2021 04:00 - 05:00 | 0 | 0 | 0 | 0 |
| 22.05.2021 05:00 - 06:00 | 0 | 0 | 0 | 0 |
| 22.05.2021 06:00 - 07:00 | 0 | 0 | 0 | 0 |
| 22.05.2021 07:00 - 08:00 | 0 | 0 | 0 | 0 |
| 22.05.2021 08:00 - 09:00 | 0 | 0 | 0 | 0 |
| 22.05.2021 09:00 - 10:00 | 0 | 0 | 0 | 0 |
| 22.05.2021 10:00 - 11:00 | 0 | 0 | 0 | 0 |
| 22.05.2021 11:00 - 12:00 | 0 | 0 | 0 | 0 |
| 22.05.2021 12:00 - 13:00 | 0 | 0 | 0 | 0 |
| 22.05.2021 13:00 - 14:00 | 0 | 0 | 0 | 0 |
| 22.05.2021 14:00 - 15:00 | 0 | 0 | 0 | 0 |
| 22.05.2021 15:00 - 16:00 | 0 | 0 | 0 | 0 |
| 22.05.2021 16:00 - 17:00 | 0 | 0 | 0 | 0 |
| 22.05.2021 17:00 - 18:00 | 0 | 0 | 0 | 0 |
| 22.05.2021 18:00 - 19:00 | 0 | 0 | 0 | 0 |
| 22.05.2021 19:00 - 20:00 | 0 | 0 | 0 | 0 |
| 22.05.2021 20:00 - 21:00 | 0 | 0 | 0 | 0 |
| 22.05.2021 21:00 - 22:00 | 0 | 0 | 0 | 0 |
| 22.05.2021 22:00 - 23:00 | 0 | 0 | 0 | 0 |
| 22.05.2021 23:00 - 24:00 | 0 | 0 | 0 | 0 |
| 23.05.2021 00:00 - 01:00 | 0 | 0 | 0 | 0 |
| 23.05.2021 01:00 - 02:00 | 0 | 0 | 0 | 0 |
| 23.05.2021 02:00 - 03:00 | 0 | 0 | 0 | 0 |
| 23.05.2021 03:00 - 04:00 | 0 | 0 | 0 | 0 |
| 23.05.2021 04:00 - 05:00 | 0 | 0 | 0 | 0 |
| 23.05.2021 05:00 - 06:00 | 0 | 0 | 0 | 0 |
| 23.05.2021 06:00 - 07:00 | 0 | 0 | 0 | 0 |
| 23.05.2021 07:00 - 08:00 | 0 | 0 | 0 | 0 |
| 23.05.2021 08:00 - 09:00 | 0 | 0 | 0 | 0 |
| 23.05.2021 09:00 - 10:00 | 0 | 0 | 0 | 0 |
| 23.05.2021 10:00 - 11:00 | 0 | 0 | 0 | 0 |
| 23.05.2021 11:00 - 12:00 | 0 | 0 | 0 | 0 |
| 23.05.2021 12:00 - 13:00 | 0 | 0 | 0 | 0 |
| 23.05.2021 13:00 - 14:00 | 0 | 0 | 0 | 0 |
| 23.05.2021 14:00 - 15:00 | 0 | 0 | 0 | 0 |
| 23.05.2021 15:00 - 16:00 | 0 | 0 | 0 | 0 |
| 23.05.2021 16:00 - 17:00 | 0 | 0 | 0 | 0 |
| 23.05.2021 17:00 - 18:00 | 0 | 0 | 0 | 0 |
| 23.05.2021 18:00 - 19:00 | 0 | 0 | 0 | 0 |
| 23.05.2021 19:00 - 20:00 | 0 | 0 | 0 | 0 |
| 23.05.2021 20:00 - 21:00 | 0 | 0 | 0 | 0 |
| 23.05.2021 21:00 - 22:00 | 0 | 0 | 0 | 0 |
| 23.05.2021 22:00 - 23:00 | 0 | 0 | 0 | 0 |
| 23.05.2021 23:00 - 24:00 | 0 | 0 | 0 | 0 |
| 24.05.2021 00:00 - 01:00 | 0 | 0 | 0 | 0 |
| 24.05.2021 01:00 - 02:00 | 0 | 0 | 0 | 0 |
| 24.05.2021 02:00 - 03:00 | 0 | 0 | 0 | 0 |
| 24.05.2021 03:00 - 04:00 | 0 | 0 | 0 | 0 |
| 24.05.2021 04:00 - 05:00 | 0 | 0 | 0 | 0 |
| 24.05.2021 05:00 - 06:00 | 0 | 0 | 0 | 0 |
| 24.05.2021 06:00 - 07:00 | 0 | 0 | 0 | 0 |
| 24.05.2021 07:00 - 08:00 | 0 | 0 | 0 | 0 |
| 24.05.2021 08:00 - 09:00 | 0 | 0 | 0 | 0 |
| 24.05.2021 09:00 - 10:00 | 0 | 0 | 0 | 0 |
| 24.05.2021 10:00 - 11:00 | 0 | 0 | 0 | 0 |
| 24.05.2021 11:00 - 12:00 | 0 | 0 | 0 | 0 |
| 24.05.2021 12:00 - 13:00 | 0 | 0 | 0 | 0 |
| 24.05.2021 13:00 - 14:00 | 0 | 0 | 0 | 0 |
| 24.05.2021 14:00 - 15:00 | 0 | 0 | 0 | 0 |
| 24.05.2021 15:00 - 16:00 | 0 | 0 | 0 | 0 |
| 24.05.2021 16:00 - 17:00 | 0 | 0 | 0 | 0 |
| 24.05.2021 17:00 - 18:00 | 0 | 0 | 0 | 0 |
| 24.05.2021 18:00 - 19:00 | 0 | 0 | 0 | 0 |
| 24.05.2021 19:00 - 20:00 | 0 | 0 | 0 | 0 |
| 24.05.2021 20:00 - 21:00 | 0 | 0 | 0 | 0 |
| 24.05.2021 21:00 - 22:00 | 0 | 0 | 0 | 0 |
| 24.05.2021 22:00 - 23:00 | 0 | 0 | 0 | 0 |
| 24.05.2021 23:00 - 24:00 | 700 | 0 | 0 | 0 |
| 25.05.2021 00:00 - 01:00 | 700 | 0 | 0 | 0 |
| 25.05.2021 01:00 - 02:00 | 700 | 0 | 0 | 0 |
| 25.05.2021 02:00 - 03:00 | 700 | 0 | 0 | 0 |
| 25.05.2021 03:00 - 04:00 | 700 | 0 | 0 | 0 |
| 25.05.2021 04:00 - 05:00 | 700 | 0 | 0 | 0 |
| 25.05.2021 05:00 - 06:00 | 700 | 0 | 0 | 0 |
| 25.05.2021 06:00 - 07:00 | 0 | 0 | 0 | 0 |
| 25.05.2021 07:00 - 08:00 | 0 | 0 | 0 | 0 |
| 25.05.2021 08:00 - 09:00 | 0 | 0 | 0 | 0 |
| 25.05.2021 09:00 - 10:00 | 0 | 0 | 0 | 0 |
| 25.05.2021 10:00 - 11:00 | 0 | 0 | 0 | 0 |
| 25.05.2021 11:00 - 12:00 | 0 | 0 | 0 | 0 |
| 25.05.2021 12:00 - 13:00 | 0 | 0 | 0 | 0 |
| 25.05.2021 13:00 - 14:00 | 0 | 0 | 0 | 0 |
| 25.05.2021 14:00 - 15:00 | 300 | 0 | 0 | 0 |
| 25.05.2021 15:00 - 16:00 | 300 | 0 | 0 | 0 |
| 25.05.2021 16:00 - 17:00 | 300 | 0 | 0 | 0 |
| 25.05.2021 17:00 - 18:00 | 300 | 0 | 0 | 0 |
| 25.05.2021 18:00 - 19:00 | 300 | 0 | 0 | 0 |
| 25.05.2021 19:00 - 20:00 | 300 | 0 | 0 | 0 |
| 25.05.2021 20:00 - 21:00 | 300 | 0 | 0 | 0 |
| 25.05.2021 21:00 - 22:00 | 300 | 0 | 0 | 0 |
| 25.05.2021 22:00 - 23:00 | 700 | 0 | 0 | 0 |
| 25.05.2021 23:00 - 24:00 | 700 | 0 | 0 | 0 |
| 26.05.2021 00:00 - 01:00 | 700 | 0 | 0 | 0 |
| 26.05.2021 01:00 - 02:00 | 700 | 0 | 0 | 0 |
| 26.05.2021 02:00 - 03:00 | 700 | 0 | 0 | 0 |
| 26.05.2021 03:00 - 04:00 | 700 | 0 | 0 | 0 |
| 26.05.2021 04:00 - 05:00 | 700 | 0 | 0 | 0 |
| 26.05.2021 05:00 - 06:00 | 700 | 0 | 0 | 0 |
| 26.05.2021 06:00 - 07:00 | 0 | 0 | 0 | 0 |
| 26.05.2021 07:00 - 08:00 | 0 | 0 | 0 | 0 |
| 26.05.2021 08:00 - 09:00 | 0 | 0 | 0 | 0 |
| 26.05.2021 09:00 - 10:00 | 0 | 0 | 0 | 0 |
| 26.05.2021 10:00 - 11:00 | 0 | 0 | 0 | 0 |
| 26.05.2021 11:00 - 12:00 | 0 | 0 | 0 | 0 |
| 26.05.2021 12:00 - 13:00 | 300 | 0 | 0 | 0 |
| 26.05.2021 13:00 - 14:00 | 300 | 0 | 0 | 0 |
| 26.05.2021 14:00 - 15:00 | 500 | 0 | 0 | 0 |
| 26.05.2021 15:00 - 16:00 | 500 | 0 | 0 | 0 |
| 26.05.2021 16:00 - 17:00 | 500 | 0 | 0 | 0 |
| 26.05.2021 17:00 - 18:00 | 500 | 0 | 0 | 0 |
| 26.05.2021 18:00 - 19:00 | 500 | 0 | 0 | 0 |
| 26.05.2021 19:00 - 20:00 | 1000 | 0 | 0 | 0 |
| 26.05.2021 20:00 - 21:00 | 1000 | 0 | 0 | 0 |
| 26.05.2021 21:00 - 22:00 | 1000 | 0 | 0 | 0 |
| 26.05.2021 22:00 - 23:00 | 1000 | 0 | 0 | 0 |
| 26.05.2021 23:00 - 24:00 | 1000 | 0 | 0 | 0 |
| 27.05.2021 00:00 - 01:00 | 1000 | 0 | 0 | 0 |
| 27.05.2021 01:00 - 02:00 | 1000 | 0 | 0 | 0 |
| 27.05.2021 02:00 - 03:00 | 1000 | 0 | 0 | 0 |
| 27.05.2021 03:00 - 04:00 | 1000 | 0 | 0 | 0 |
| 27.05.2021 04:00 - 05:00 | 1000 | 0 | 0 | 0 |
| 27.05.2021 05:00 - 06:00 | 1000 | 0 | 0 | 0 |
| 27.05.2021 06:00 - 07:00 | 0 | 0 | 0 | 0 |
| 27.05.2021 07:00 - 08:00 | 0 | 0 | 0 | 0 |
| 27.05.2021 08:00 - 09:00 | 200 | 0 | 0 | 0 |
| 27.05.2021 09:00 - 10:00 | 200 | 0 | 0 | 0 |
| 27.05.2021 10:00 - 11:00 | 200 | 0 | 0 | 0 |
| 27.05.2021 11:00 - 12:00 | 200 | 0 | 0 | 0 |
| 27.05.2021 12:00 - 13:00 | 200 | 0 | 0 | 0 |
| 27.05.2021 13:00 - 14:00 | 200 | 0 | 0 | 0 |
| 27.05.2021 14:00 - 15:00 | 200 | 0 | 0 | 0 |
| 27.05.2021 15:00 - 16:00 | 200 | 0 | 0 | 0 |
| 27.05.2021 16:00 - 17:00 | 200 | 0 | 0 | 0 |
| 27.05.2021 17:00 - 18:00 | 200 | 0 | 0 | 0 |
| 27.05.2021 18:00 - 19:00 | 200 | 0 | 0 | 0 |
| 27.05.2021 19:00 - 20:00 | 200 | 0 | 0 | 0 |
| 27.05.2021 20:00 - 21:00 | 200 | 0 | 0 | 0 |
| 27.05.2021 21:00 - 22:00 | 200 | 0 | 0 | 0 |
| 27.05.2021 22:00 - 23:00 | 200 | 0 | 0 | 0 |
| 27.05.2021 23:00 - 24:00 | 200 | 0 | 0 | 0 |
| 28.05.2021 00:00 - 01:00 | 200 | 0 | 0 | 0 |
| 28.05.2021 01:00 - 02:00 | 200 | 0 | 0 | 0 |
| 28.05.2021 02:00 - 03:00 | 200 | 0 | 0 | 0 |
| 28.05.2021 03:00 - 04:00 | 200 | 0 | 0 | 0 |
| 28.05.2021 04:00 - 05:00 | 200 | 0 | 0 | 0 |
| 28.05.2021 05:00 - 06:00 | 200 | 0 | 0 | 0 |
| 28.05.2021 06:00 - 07:00 | 0 | 0 | 0 | 0 |
| 28.05.2021 07:00 - 08:00 | 0 | 0 | 0 | 0 |
| 28.05.2021 08:00 - 09:00 | 0 | 0 | 0 | 0 |
| 28.05.2021 09:00 - 10:00 | 0 | 0 | 0 | 0 |
| 28.05.2021 10:00 - 11:00 | 0 | 0 | 0 | 0 |
| 28.05.2021 11:00 - 12:00 | 0 | 0 | 0 | 0 |
| 28.05.2021 12:00 - 13:00 | 0 | 0 | 0 | 0 |
| 28.05.2021 13:00 - 14:00 | 0 | 0 | 0 | 0 |
| 28.05.2021 14:00 - 15:00 | 0 | 0 | 0 | 0 |
| 28.05.2021 15:00 - 16:00 | 0 | 0 | 0 | 0 |
| 28.05.2021 16:00 - 17:00 | 0 | 0 | 0 | 0 |
| 28.05.2021 17:00 - 18:00 | 0 | 0 | 0 | 0 |
| 28.05.2021 18:00 - 19:00 | 0 | 0 | 0 | 0 |
| 28.05.2021 19:00 - 20:00 | 0 | 0 | 0 | 0 |
| 28.05.2021 20:00 - 21:00 | 0 | 0 | 0 | 0 |
| 28.05.2021 21:00 - 22:00 | 0 | 0 | 0 | 0 |
| 28.05.2021 22:00 - 23:00 | 0 | 0 | 0 | 0 |
| 28.05.2021 23:00 - 24:00 | 0 | 0 | 0 | 0 |
| 29.05.2021 00:00 - 01:00 | 0 | 0 | 0 | 0 |
| 29.05.2021 01:00 - 02:00 | 0 | 0 | 0 | 0 |
| 29.05.2021 02:00 - 03:00 | 0 | 0 | 0 | 0 |
| 29.05.2021 03:00 - 04:00 | 0 | 0 | 0 | 0 |
| 29.05.2021 04:00 - 05:00 | 0 | 0 | 0 | 0 |
| 29.05.2021 05:00 - 06:00 | 0 | 0 | 0 | 0 |
| 29.05.2021 06:00 - 07:00 | 0 | 0 | 0 | 0 |
| 29.05.2021 07:00 - 08:00 | 0 | 0 | 0 | 0 |
| 29.05.2021 08:00 - 09:00 | 0 | 0 | 0 | 0 |
| 29.05.2021 09:00 - 10:00 | 0 | 0 | 0 | 0 |
| 29.05.2021 10:00 - 11:00 | 0 | 0 | 0 | 0 |
| 29.05.2021 11:00 - 12:00 | 0 | 0 | 0 | 0 |
| 29.05.2021 12:00 - 13:00 | 0 | 0 | 0 | 0 |
| 29.05.2021 13:00 - 14:00 | 0 | 0 | 0 | 0 |
| 29.05.2021 14:00 - 15:00 | 0 | 0 | 0 | 0 |
| 29.05.2021 15:00 - 16:00 | 0 | 0 | 0 | 0 |
| 29.05.2021 16:00 - 17:00 | 0 | 0 | 0 | 0 |
| 29.05.2021 17:00 - 18:00 | 0 | 0 | 0 | 0 |
| 29.05.2021 18:00 - 19:00 | 0 | 0 | 0 | 0 |
| 29.05.2021 19:00 - 20:00 | 0 | 0 | 0 | 0 |
| 29.05.2021 20:00 - 21:00 | 0 | 0 | 0 | 0 |
| 29.05.2021 21:00 - 22:00 | 0 | 0 | 0 | 0 |
| 29.05.2021 22:00 - 23:00 | 0 | 0 | 0 | 0 |
| 29.05.2021 23:00 - 24:00 | 0 | 0 | 0 | 0 |
| 30.05.2021 00:00 - 01:00 | 0 | 0 | 0 | 0 |
| 30.05.2021 01:00 - 02:00 | 0 | 0 | 0 | 0 |
| 30.05.2021 02:00 - 03:00 | 0 | 0 | 0 | 0 |
| 30.05.2021 03:00 - 04:00 | 0 | 0 | 0 | 0 |
| 30.05.2021 04:00 - 05:00 | 0 | 0 | 0 | 0 |
| 30.05.2021 05:00 - 06:00 | 0 | 0 | 0 | 0 |
| 30.05.2021 06:00 - 07:00 | 0 | 0 | 0 | 0 |
| 30.05.2021 07:00 - 08:00 | 0 | 0 | 0 | 0 |
| 30.05.2021 08:00 - 09:00 | 0 | 0 | 0 | 0 |
| 30.05.2021 09:00 - 10:00 | 0 | 0 | 0 | 0 |
| 30.05.2021 10:00 - 11:00 | 0 | 0 | 0 | 0 |
| 30.05.2021 11:00 - 12:00 | 0 | 0 | 0 | 0 |
| 30.05.2021 12:00 - 13:00 | 0 | 0 | 0 | 0 |
| 30.05.2021 13:00 - 14:00 | 0 | 0 | 0 | 0 |
| 30.05.2021 14:00 - 15:00 | 0 | 0 | 0 | 0 |
| 30.05.2021 15:00 - 16:00 | 0 | 0 | 0 | 0 |
| 30.05.2021 16:00 - 17:00 | 0 | 0 | 0 | 0 |
| 30.05.2021 17:00 - 18:00 | 0 | 0 | 0 | 0 |
| 30.05.2021 18:00 - 19:00 | 0 | 0 | 0 | 0 |
| 30.05.2021 19:00 - 20:00 | 0 | 0 | 0 | 0 |
| 30.05.2021 20:00 - 21:00 | 0 | 0 | 0 | 0 |
| 30.05.2021 21:00 - 22:00 | 0 | 0 | 0 | 0 |
| 30.05.2021 22:00 - 23:00 | 0 | 0 | 0 | 0 |
| 30.05.2021 23:00 - 24:00 | 0 | 0 | 0 | 0 |
| 31.05.2021 00:00 - 01:00 | 0 | 0 | 0 | 0 |
| 31.05.2021 01:00 - 02:00 | 0 | 0 | 0 | 0 |
| 31.05.2021 02:00 - 03:00 | 0 | 0 | 0 | 0 |
| 31.05.2021 03:00 - 04:00 | 0 | 0 | 0 | 0 |
| 31.05.2021 04:00 - 05:00 | 0 | 0 | 0 | 0 |
| 31.05.2021 05:00 - 06:00 | 0 | 0 | 0 | 0 |
| 31.05.2021 06:00 - 07:00 | 0 | 0 | 0 | 0 |
| 31.05.2021 07:00 - 08:00 | 0 | 0 | 0 | 0 |
| 31.05.2021 08:00 - 09:00 | 0 | 0 | 0 | 0 |
| 31.05.2021 09:00 - 10:00 | 0 | 0 | 0 | 0 |
| 31.05.2021 10:00 - 11:00 | 0 | 0 | 0 | 0 |
| 31.05.2021 11:00 - 12:00 | 0 | 0 | 0 | 0 |
| 31.05.2021 12:00 - 13:00 | 0 | 0 | 0 | 0 |
| 31.05.2021 13:00 - 14:00 | 0 | 0 | 0 | 0 |
| 31.05.2021 14:00 - 15:00 | 0 | 0 | 0 | 0 |
| 31.05.2021 15:00 - 16:00 | 0 | 0 | 0 | 0 |
| 31.05.2021 16:00 - 17:00 | 0 | 0 | 0 | 0 |
| 31.05.2021 17:00 - 18:00 | 0 | 0 | 0 | 0 |
| 31.05.2021 18:00 - 19:00 | 0 | 0 | 0 | 0 |
| 31.05.2021 19:00 - 20:00 | 0 | 0 | 0 | 0 |
| 31.05.2021 20:00 - 21:00 | 0 | 0 | 0 | 0 |
| 31.05.2021 21:00 - 22:00 | 0 | 0 | 0 | 0 |
| 31.05.2021 22:00 - 23:00 | 0 | 0 | 0 | 0 |
| 31.05.2021 23:00 - 24:00 | 0 | 0 | 0 | 0 |
| 01.06.2021 00:00 - 01:00 | 0 | 0 | 0 | 0 |
| 01.06.2021 01:00 - 02:00 | 0 | 0 | 0 | 0 |
| 01.06.2021 02:00 - 03:00 | 0 | 0 | 0 | 0 |
| 01.06.2021 03:00 - 04:00 | 0 | 0 | 0 | 0 |
| 01.06.2021 04:00 - 05:00 | 0 | 0 | 0 | 0 |
| 01.06.2021 05:00 - 06:00 | 0 | 0 | 0 | 0 |